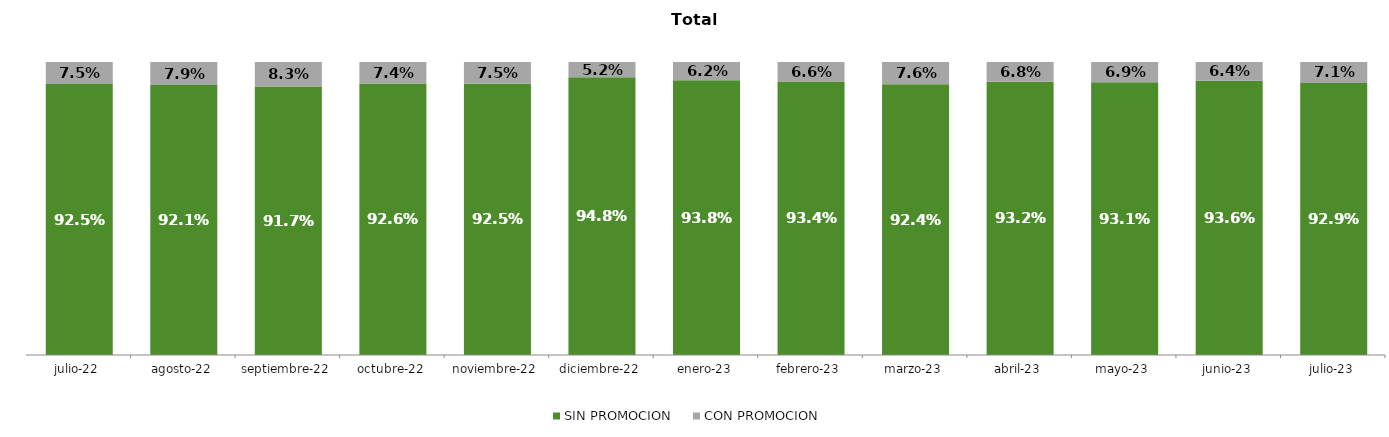
| Category | SIN PROMOCION   | CON PROMOCION   |
|---|---|---|
| 2022-07-01 | 0.925 | 0.075 |
| 2022-08-01 | 0.921 | 0.079 |
| 2022-09-01 | 0.917 | 0.083 |
| 2022-10-01 | 0.926 | 0.074 |
| 2022-11-01 | 0.925 | 0.075 |
| 2022-12-01 | 0.948 | 0.052 |
| 2023-01-01 | 0.938 | 0.062 |
| 2023-02-01 | 0.934 | 0.066 |
| 2023-03-01 | 0.924 | 0.076 |
| 2023-04-01 | 0.932 | 0.068 |
| 2023-05-01 | 0.931 | 0.069 |
| 2023-06-01 | 0.936 | 0.064 |
| 2023-07-01 | 0.929 | 0.071 |